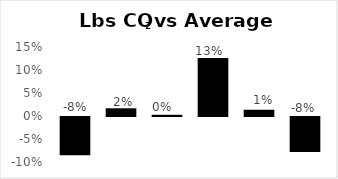
| Category | Series 0 |
|---|---|
| 0 | -0.083 |
| 1 | 0.017 |
| 2 | 0.003 |
| 3 | 0.126 |
| 4 | 0.014 |
| 5 | -0.076 |